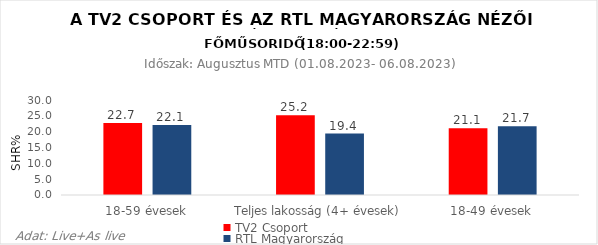
| Category | TV2 Csoport | RTL Magyarország |
|---|---|---|
| 18-59 évesek | 22.7 | 22.1 |
| Teljes lakosság (4+ évesek) | 25.2 | 19.4 |
| 18-49 évesek | 21.1 | 21.7 |